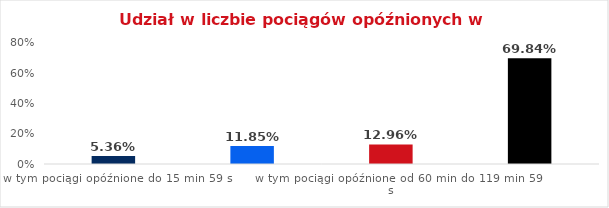
| Category | Series 0 |
|---|---|
| w tym pociągi opóźnione do 15 min 59 s | 0.054 |
| w tym pociągi opóźnione od 16 min do 59 min 59 s | 0.118 |
| w tym pociągi opóźnione od 60 min do 119 min 59 s | 0.13 |
| w tym pociągi opóźnione od 120 min | 0.698 |